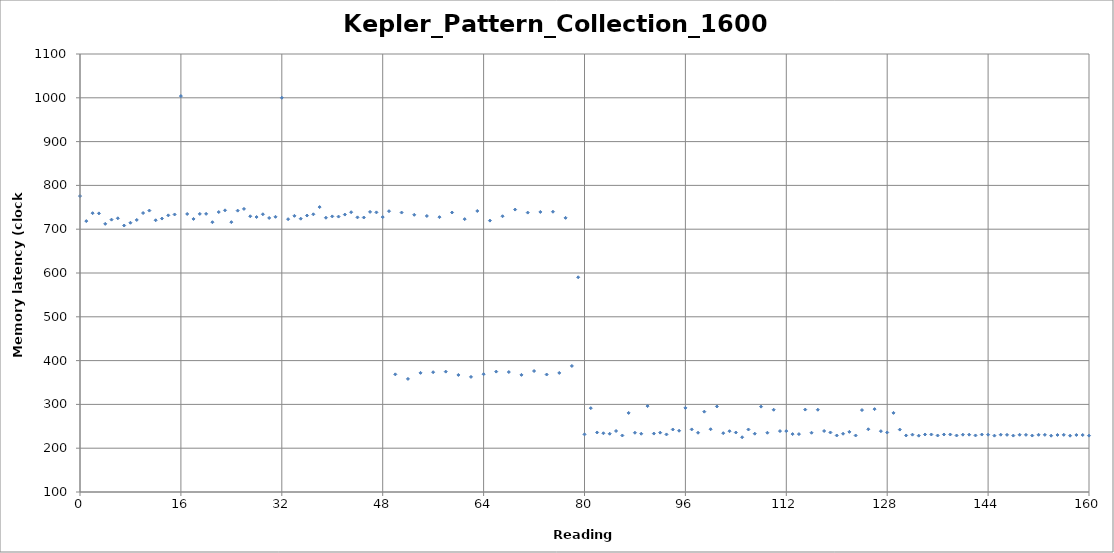
| Category | AVG |
|---|---|
| 0.0 | 775.7 |
| 1.0 | 718.5 |
| 2.0 | 736.6 |
| 3.0 | 736.1 |
| 4.0 | 712.2 |
| 5.0 | 721.8 |
| 6.0 | 724.9 |
| 7.0 | 708.4 |
| 8.0 | 714.7 |
| 9.0 | 721.1 |
| 10.0 | 736.9 |
| 11.0 | 742.5 |
| 12.0 | 720.4 |
| 13.0 | 724.3 |
| 14.0 | 731.6 |
| 15.0 | 733.6 |
| 16.0 | 1003.9 |
| 17.0 | 734.8 |
| 18.0 | 723.4 |
| 19.0 | 734.9 |
| 20.0 | 735 |
| 21.0 | 716 |
| 22.0 | 739.2 |
| 23.0 | 743.1 |
| 24.0 | 716.1 |
| 25.0 | 742.4 |
| 26.0 | 746.3 |
| 27.0 | 729.5 |
| 28.0 | 727.8 |
| 29.0 | 734.1 |
| 30.0 | 725.7 |
| 31.0 | 728.3 |
| 32.0 | 1000.1 |
| 33.0 | 722.9 |
| 34.0 | 730.5 |
| 35.0 | 724 |
| 36.0 | 731.2 |
| 37.0 | 734 |
| 38.0 | 750.5 |
| 39.0 | 726.2 |
| 40.0 | 729.2 |
| 41.0 | 728.8 |
| 42.0 | 733.4 |
| 43.0 | 738.8 |
| 44.0 | 727 |
| 45.0 | 726.7 |
| 46.0 | 739.5 |
| 47.0 | 738.4 |
| 48.0 | 727.7 |
| 49.0 | 741.1 |
| 50.0 | 368.6 |
| 51.0 | 738 |
| 52.0 | 358.2 |
| 53.0 | 732.9 |
| 54.0 | 372 |
| 55.0 | 730.2 |
| 56.0 | 373.5 |
| 57.0 | 727.5 |
| 58.0 | 374.8 |
| 59.0 | 738.1 |
| 60.0 | 367.2 |
| 61.0 | 723 |
| 62.0 | 362.8 |
| 63.0 | 741.6 |
| 64.0 | 368.9 |
| 65.0 | 719.6 |
| 66.0 | 374.9 |
| 67.0 | 729.6 |
| 68.0 | 373.9 |
| 69.0 | 744.8 |
| 70.0 | 367.4 |
| 71.0 | 737.9 |
| 72.0 | 376.2 |
| 73.0 | 739.4 |
| 74.0 | 368.2 |
| 75.0 | 739.9 |
| 76.0 | 371.8 |
| 77.0 | 725.9 |
| 78.0 | 387.8 |
| 79.0 | 590.2 |
| 80.0 | 231.5 |
| 81.0 | 291.4 |
| 82.0 | 235.9 |
| 83.0 | 234.1 |
| 84.0 | 233 |
| 85.0 | 239.3 |
| 86.0 | 229 |
| 87.0 | 280.6 |
| 88.0 | 235.3 |
| 89.0 | 233 |
| 90.0 | 296.1 |
| 91.0 | 233.4 |
| 92.0 | 235.5 |
| 93.0 | 231.4 |
| 94.0 | 242.7 |
| 95.0 | 239.9 |
| 96.0 | 292.1 |
| 97.0 | 242.9 |
| 98.0 | 235.3 |
| 99.0 | 283.4 |
| 100.0 | 243.3 |
| 101.0 | 295.3 |
| 102.0 | 234.3 |
| 103.0 | 238.8 |
| 104.0 | 235.8 |
| 105.0 | 225 |
| 106.0 | 242.7 |
| 107.0 | 233.1 |
| 108.0 | 294.9 |
| 109.0 | 235.3 |
| 110.0 | 287.8 |
| 111.0 | 239.1 |
| 112.0 | 239.1 |
| 113.0 | 232.2 |
| 114.0 | 232.2 |
| 115.0 | 288.2 |
| 116.0 | 235.3 |
| 117.0 | 287.8 |
| 118.0 | 239.3 |
| 119.0 | 235.9 |
| 120.0 | 229 |
| 121.0 | 233 |
| 122.0 | 237.3 |
| 123.0 | 229 |
| 124.0 | 287.1 |
| 125.0 | 243.2 |
| 126.0 | 289.2 |
| 127.0 | 238.9 |
| 128.0 | 235.9 |
| 129.0 | 280.6 |
| 130.0 | 242.5 |
| 131.0 | 229.1 |
| 132.0 | 230.9 |
| 133.0 | 228.6 |
| 134.0 | 231.3 |
| 135.0 | 231.3 |
| 136.0 | 229 |
| 137.0 | 231.3 |
| 138.0 | 231.3 |
| 139.0 | 229 |
| 140.0 | 230.9 |
| 141.0 | 230.9 |
| 142.0 | 229.1 |
| 143.0 | 231.2 |
| 144.0 | 230.9 |
| 145.0 | 228.7 |
| 146.0 | 230.8 |
| 147.0 | 230.5 |
| 148.0 | 228.8 |
| 149.0 | 230.7 |
| 150.0 | 230.5 |
| 151.0 | 228.9 |
| 152.0 | 230.6 |
| 153.0 | 230.5 |
| 154.0 | 228.6 |
| 155.0 | 230.2 |
| 156.0 | 230.5 |
| 157.0 | 228.6 |
| 158.0 | 230.2 |
| 159.0 | 230.1 |
| 160.0 | 228.7 |
| 161.0 | 229.7 |
| 162.0 | 230.1 |
| 163.0 | 228.7 |
| 164.0 | 230.1 |
| 165.0 | 230.1 |
| 166.0 | 229.1 |
| 167.0 | 230.5 |
| 168.0 | 230.9 |
| 169.0 | 229.1 |
| 170.0 | 230.5 |
| 171.0 | 230.9 |
| 172.0 | 229.5 |
| 173.0 | 230.4 |
| 174.0 | 228.8 |
| 175.0 | 229.2 |
| 176.0 | 230.4 |
| 177.0 | 231.3 |
| 178.0 | 229.6 |
| 179.0 | 230.7 |
| 180.0 | 231.3 |
| 181.0 | 229.2 |
| 182.0 | 230.3 |
| 183.0 | 230.9 |
| 184.0 | 229.2 |
| 185.0 | 230.3 |
| 186.0 | 231.3 |
| 187.0 | 229.2 |
| 188.0 | 230.4 |
| 189.0 | 231.3 |
| 190.0 | 229.5 |
| 191.0 | 230.4 |
| 192.0 | 231.3 |
| 193.0 | 229.2 |
| 194.0 | 230.4 |
| 195.0 | 231.2 |
| 196.0 | 231.3 |
| 197.0 | 229.1 |
| 198.0 | 230.8 |
| 199.0 | 231.3 |
| 200.0 | 229.1 |
| 201.0 | 231.2 |
| 202.0 | 230.9 |
| 203.0 | 228.7 |
| 204.0 | 230.8 |
| 205.0 | 230.9 |
| 206.0 | 228.7 |
| 207.0 | 230.8 |
| 208.0 | 230.9 |
| 209.0 | 228.3 |
| 210.0 | 228.7 |
| 211.0 | 230.5 |
| 212.0 | 227.6 |
| 213.0 | 229.1 |
| 214.0 | 230.9 |
| 215.0 | 228.3 |
| 216.0 | 230.8 |
| 217.0 | 230.9 |
| 218.0 | 228.7 |
| 219.0 | 230.8 |
| 220.0 | 230.9 |
| 221.0 | 228.7 |
| 222.0 | 230.8 |
| 223.0 | 230.9 |
| 224.0 | 228.7 |
| 225.0 | 230.4 |
| 226.0 | 230.5 |
| 227.0 | 228.3 |
| 228.0 | 230.4 |
| 229.0 | 230.5 |
| 230.0 | 228.3 |
| 231.0 | 230.8 |
| 232.0 | 231.3 |
| 233.0 | 229.1 |
| 234.0 | 231.2 |
| 235.0 | 231.3 |
| 236.0 | 228.7 |
| 237.0 | 229.1 |
| 238.0 | 230.5 |
| 239.0 | 228.5 |
| 240.0 | 230.3 |
| 241.0 | 230.5 |
| 242.0 | 228.5 |
| 243.0 | 230.2 |
| 244.0 | 230.9 |
| 245.0 | 229.4 |
| 246.0 | 230.9 |
| 247.0 | 230.9 |
| 248.0 | 229 |
| 249.0 | 230.1 |
| 250.0 | 229.2 |
| 251.0 | 229 |
| 252.0 | 230.5 |
| 253.0 | 231.3 |
| 254.0 | 229.4 |
| 255.0 | 230.5 |